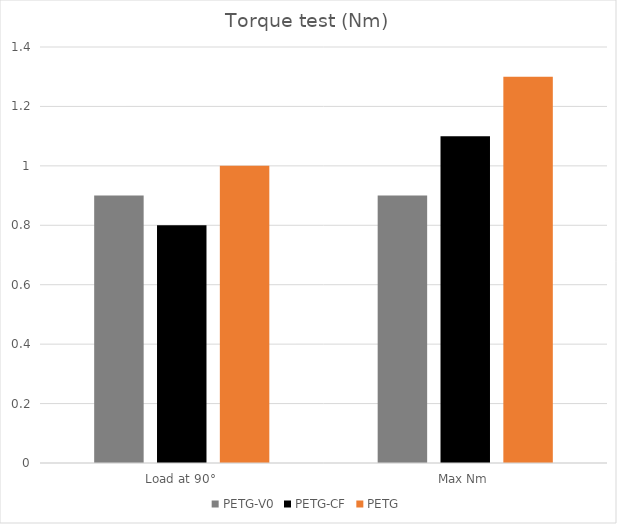
| Category | PETG-V0 | PETG-CF | PETG |
|---|---|---|---|
| Load at 90° | 0.9 | 0.8 | 1 |
| Max Nm | 0.9 | 1.1 | 1.3 |